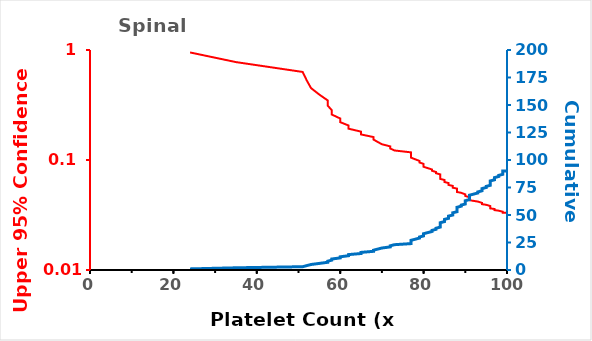
| Category | PLATELETS |
|---|---|
| 24.0 | 0.95 |
| 35.0 | 0.776 |
| 51.0 | 0.632 |
| 52.0 | 0.527 |
| 53.0 | 0.451 |
| 55.0 | 0.393 |
| 57.0 | 0.348 |
| 57.0 | 0.312 |
| 58.0 | 0.283 |
| 58.0 | 0.259 |
| 60.0 | 0.238 |
| 60.0 | 0.221 |
| 62.0 | 0.206 |
| 62.0 | 0.193 |
| 65.0 | 0.181 |
| 65.0 | 0.171 |
| 68.0 | 0.162 |
| 68.0 | 0.153 |
| 69.0 | 0.146 |
| 70.0 | 0.139 |
| 72.0 | 0.133 |
| 72.0 | 0.127 |
| 73.0 | 0.122 |
| 77.0 | 0.117 |
| 77.0 | 0.113 |
| 77.0 | 0.109 |
| 77.0 | 0.105 |
| 78.0 | 0.101 |
| 79.0 | 0.098 |
| 79.0 | 0.095 |
| 80.0 | 0.092 |
| 80.0 | 0.089 |
| 80.0 | 0.087 |
| 81.0 | 0.084 |
| 82.0 | 0.082 |
| 82.0 | 0.08 |
| 83.0 | 0.078 |
| 83.0 | 0.076 |
| 84.0 | 0.074 |
| 84.0 | 0.072 |
| 84.0 | 0.07 |
| 84.0 | 0.069 |
| 84.0 | 0.067 |
| 85.0 | 0.066 |
| 85.0 | 0.064 |
| 85.0 | 0.063 |
| 86.0 | 0.062 |
| 86.0 | 0.061 |
| 86.0 | 0.059 |
| 87.0 | 0.058 |
| 87.0 | 0.057 |
| 87.0 | 0.056 |
| 88.0 | 0.055 |
| 88.0 | 0.054 |
| 88.0 | 0.053 |
| 88.0 | 0.052 |
| 88.0 | 0.051 |
| 89.0 | 0.05 |
| 89.0 | 0.05 |
| 90.0 | 0.049 |
| 90.0 | 0.048 |
| 90.0 | 0.047 |
| 90.0 | 0.046 |
| 91.0 | 0.046 |
| 91.0 | 0.045 |
| 91.0 | 0.044 |
| 91.0 | 0.044 |
| 91.0 | 0.043 |
| 92.0 | 0.042 |
| 93.0 | 0.042 |
| 93.0 | 0.041 |
| 94.0 | 0.041 |
| 94.0 | 0.04 |
| 94.0 | 0.04 |
| 95.0 | 0.039 |
| 95.0 | 0.039 |
| 96.0 | 0.038 |
| 96.0 | 0.038 |
| 96.0 | 0.037 |
| 96.0 | 0.037 |
| 96.0 | 0.036 |
| 97.0 | 0.036 |
| 97.0 | 0.035 |
| 97.0 | 0.035 |
| 98.0 | 0.035 |
| 98.0 | 0.034 |
| 99.0 | 0.034 |
| 99.0 | 0.033 |
| 99.0 | 0.033 |
| 99.0 | 0.033 |
| 125.0 | 0.032 |
| 125.0 | 0.032 |
| 125.0 | 0.032 |
| 125.0 | 0.031 |